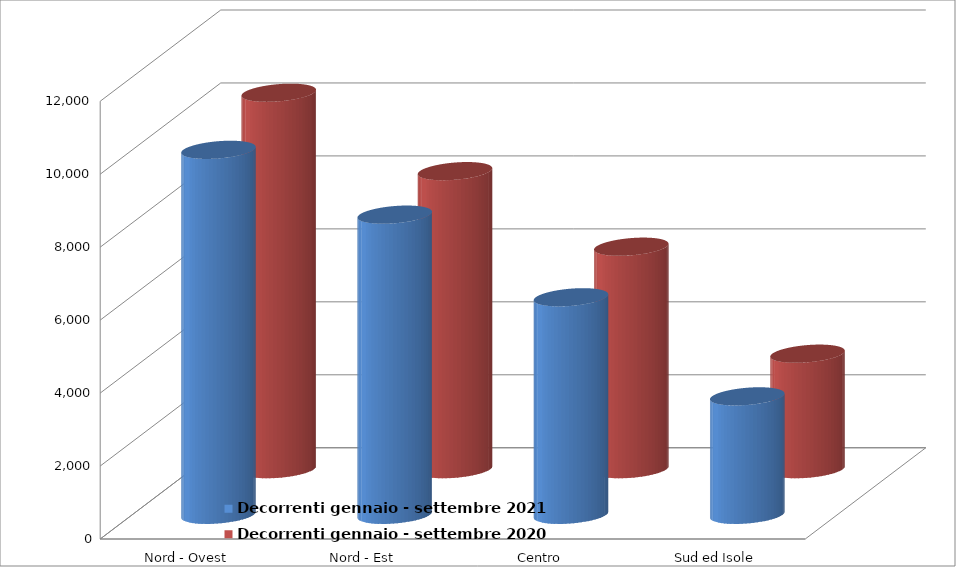
| Category | Decorrenti gennaio - settembre 2021 | Decorrenti gennaio - settembre 2020 |
|---|---|---|
| Nord - Ovest | 10005 | 10319 |
| Nord - Est | 8228 | 8170 |
| Centro | 5963 | 6099 |
| Sud ed Isole | 3247 | 3166 |